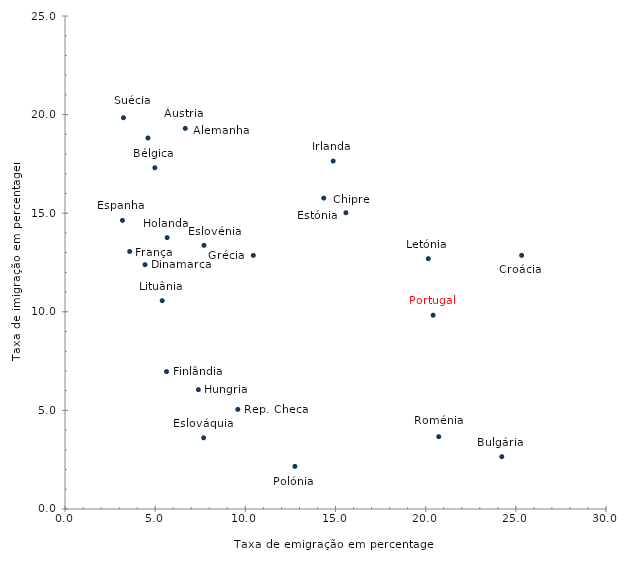
| Category | Series 0 |
|---|---|
| 4.601440049164551 | 18.813 |
| 6.6701456741872445 | 19.299 |
| 4.982589587092446 | 17.304 |
| 24.222311610727292 | 2.653 |
| 14.346164900141714 | 15.767 |
| 25.32175731279907 | 12.863 |
| 4.437430801372121 | 12.389 |
| 7.686418324421578 | 3.611 |
| 7.7057354449303785 | 13.371 |
| 3.1864611584230857 | 14.634 |
| 15.57669996886635 | 15.022 |
| 5.629035803662991 | 6.968 |
| 3.5878382030370912 | 13.06 |
| 10.443261554001053 | 12.86 |
| 5.663321811606074 | 13.763 |
| 7.395384225209232 | 6.051 |
| 14.871351509863915 | 17.645 |
| 5.389898234634917 | 10.564 |
| 20.146834750466812 | 12.693 |
| 24.17291171296529 | 5.333 |
| 13.060724372819406 | 47.616 |
| 23.28061620830776 | 25.991 |
| 12.749085419947178 | 2.159 |
| 20.412658714229995 | 9.826 |
| 9.581751094548483 | 5.051 |
| 20.725433552753394 | 3.666 |
| 3.2436106768112944 | 19.842 |